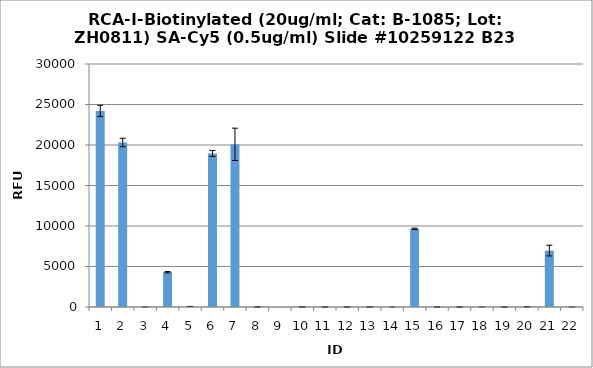
| Category | Series 0 |
|---|---|
| 0 | 24204.25 |
| 1 | 20309.25 |
| 2 | 0.25 |
| 3 | 4294.5 |
| 4 | 66.75 |
| 5 | 18958 |
| 6 | 20081.75 |
| 7 | 10.5 |
| 8 | -2 |
| 9 | 8 |
| 10 | 1 |
| 11 | -2 |
| 12 | 5.5 |
| 13 | 1 |
| 14 | 9648.75 |
| 15 | 1.75 |
| 16 | 5.5 |
| 17 | 5.5 |
| 18 | 1.75 |
| 19 | 21.5 |
| 20 | 6964.5 |
| 21 | 0.25 |